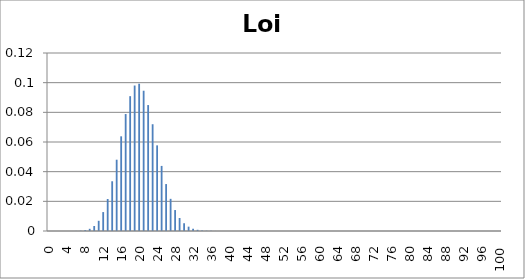
| Category | Series 0 |
|---|---|
| 0.0 | 0 |
| 1.0 | 0 |
| 2.0 | 0 |
| 3.0 | 0 |
| 4.0 | 0 |
| 5.0 | 0 |
| 6.0 | 0 |
| 7.0 | 0 |
| 8.0 | 0.001 |
| 9.0 | 0.001 |
| 10.0 | 0.003 |
| 11.0 | 0.007 |
| 12.0 | 0.013 |
| 13.0 | 0.022 |
| 14.0 | 0.034 |
| 15.0 | 0.048 |
| 16.0 | 0.064 |
| 17.0 | 0.079 |
| 18.0 | 0.091 |
| 19.0 | 0.098 |
| 20.0 | 0.099 |
| 21.0 | 0.095 |
| 22.0 | 0.085 |
| 23.0 | 0.072 |
| 24.0 | 0.058 |
| 25.0 | 0.044 |
| 26.0 | 0.032 |
| 27.0 | 0.022 |
| 28.0 | 0.014 |
| 29.0 | 0.009 |
| 30.0 | 0.005 |
| 31.0 | 0.003 |
| 32.0 | 0.002 |
| 33.0 | 0.001 |
| 34.0 | 0 |
| 35.0 | 0 |
| 36.0 | 0 |
| 37.0 | 0 |
| 38.0 | 0 |
| 39.0 | 0 |
| 40.0 | 0 |
| 41.0 | 0 |
| 42.0 | 0 |
| 43.0 | 0 |
| 44.0 | 0 |
| 45.0 | 0 |
| 46.0 | 0 |
| 47.0 | 0 |
| 48.0 | 0 |
| 49.0 | 0 |
| 50.0 | 0 |
| 51.0 | 0 |
| 52.0 | 0 |
| 53.0 | 0 |
| 54.0 | 0 |
| 55.0 | 0 |
| 56.0 | 0 |
| 57.0 | 0 |
| 58.0 | 0 |
| 59.0 | 0 |
| 60.0 | 0 |
| 61.0 | 0 |
| 62.0 | 0 |
| 63.0 | 0 |
| 64.0 | 0 |
| 65.0 | 0 |
| 66.0 | 0 |
| 67.0 | 0 |
| 68.0 | 0 |
| 69.0 | 0 |
| 70.0 | 0 |
| 71.0 | 0 |
| 72.0 | 0 |
| 73.0 | 0 |
| 74.0 | 0 |
| 75.0 | 0 |
| 76.0 | 0 |
| 77.0 | 0 |
| 78.0 | 0 |
| 79.0 | 0 |
| 80.0 | 0 |
| 81.0 | 0 |
| 82.0 | 0 |
| 83.0 | 0 |
| 84.0 | 0 |
| 85.0 | 0 |
| 86.0 | 0 |
| 87.0 | 0 |
| 88.0 | 0 |
| 89.0 | 0 |
| 90.0 | 0 |
| 91.0 | 0 |
| 92.0 | 0 |
| 93.0 | 0 |
| 94.0 | 0 |
| 95.0 | 0 |
| 96.0 | 0 |
| 97.0 | 0 |
| 98.0 | 0 |
| 99.0 | 0 |
| 100.0 | 0 |